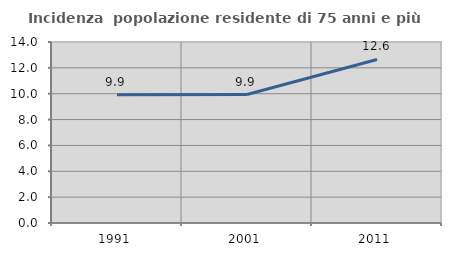
| Category | Incidenza  popolazione residente di 75 anni e più |
|---|---|
| 1991.0 | 9.91 |
| 2001.0 | 9.937 |
| 2011.0 | 12.647 |